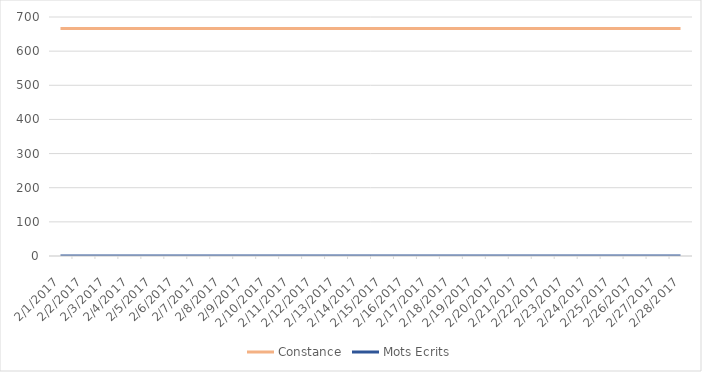
| Category | Constance | Mots Ecrits |
|---|---|---|
| 2/1/17 | 666 | 0 |
| 2/2/17 | 666 | 0 |
| 2/3/17 | 666 | 0 |
| 2/4/17 | 666 | 0 |
| 2/5/17 | 666 | 0 |
| 2/6/17 | 666 | 0 |
| 2/7/17 | 666 | 0 |
| 2/8/17 | 666 | 0 |
| 2/9/17 | 666 | 0 |
| 2/10/17 | 666 | 0 |
| 2/11/17 | 666 | 0 |
| 2/12/17 | 666 | 0 |
| 2/13/17 | 666 | 0 |
| 2/14/17 | 666 | 0 |
| 2/15/17 | 666 | 0 |
| 2/16/17 | 666 | 0 |
| 2/17/17 | 666 | 0 |
| 2/18/17 | 666 | 0 |
| 2/19/17 | 666 | 0 |
| 2/20/17 | 666 | 0 |
| 2/21/17 | 666 | 0 |
| 2/22/17 | 666 | 0 |
| 2/23/17 | 666 | 0 |
| 2/24/17 | 666 | 0 |
| 2/25/17 | 666 | 0 |
| 2/26/17 | 666 | 0 |
| 2/27/17 | 666 | 0 |
| 2/28/17 | 666 | 0 |